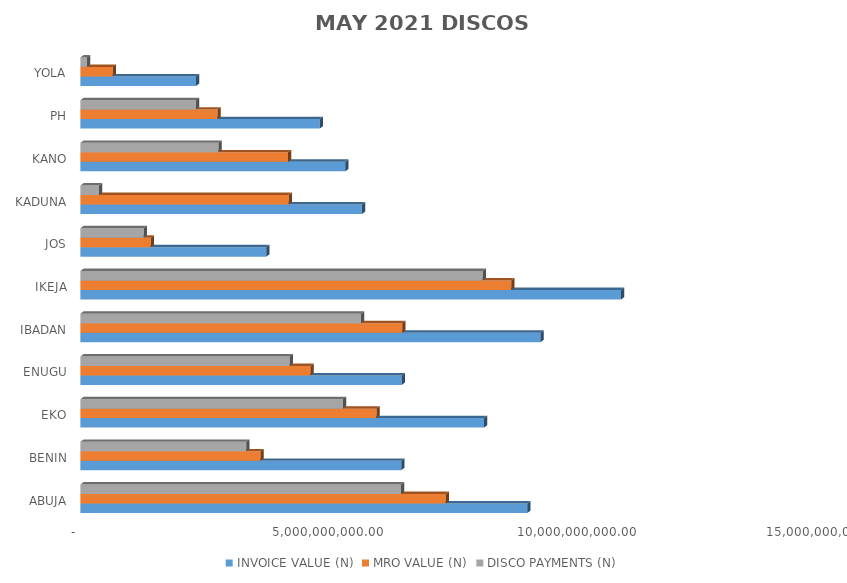
| Category | INVOICE VALUE (N) | MRO VALUE (N) | DISCO PAYMENTS (N) |
|---|---|---|---|
| ABUJA | 8981473438.601 | 7344150830.744 | 6445105339.54 |
| BENIN | 6447658745.592 | 3622939449.148 | 3334084337.351 |
| EKO | 8114464714.938 | 5950336975.464 | 5279270743.54 |
| ENUGU | 6460536785.13 | 4627682499.189 | 4208393661.835 |
| IBADAN | 9251022501.654 | 6472015342.157 | 5643123726.006 |
| IKEJA | 10869268009.76 | 8658458896.575 | 8087822326.06 |
| JOS | 3734328960.852 | 1414563810.371 | 1272659309.864 |
| KADUNA | 5659545300.969 | 4188063522.717 | 376697238.43 |
| KANO | 5326603035.79 | 4174991459.452 | 2777215698.48 |
| PH | 4811354427.037 | 2755462680.364 | 2322440781.934 |
| YOLA | 2324964186.299 | 649362497.233 | 132190170.17 |